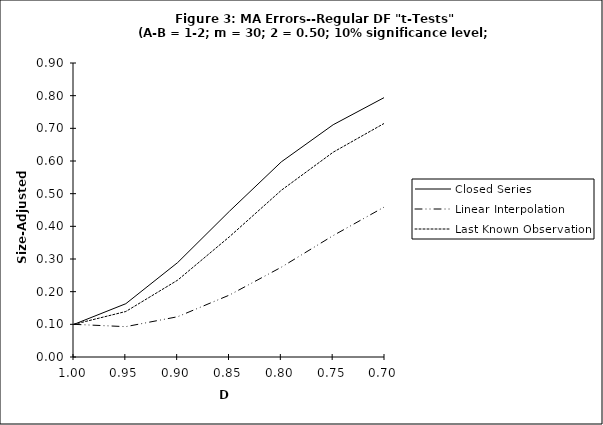
| Category | Closed Series | Linear Interpolation | Last Known Observation |
|---|---|---|---|
| 1.0 | 0.1 | 0.1 | 0.1 |
| 0.95 | 0.163 | 0.093 | 0.139 |
| 0.9 | 0.289 | 0.123 | 0.235 |
| 0.85 | 0.446 | 0.19 | 0.368 |
| 0.8 | 0.597 | 0.275 | 0.51 |
| 0.75 | 0.711 | 0.372 | 0.627 |
| 0.7 | 0.796 | 0.46 | 0.716 |